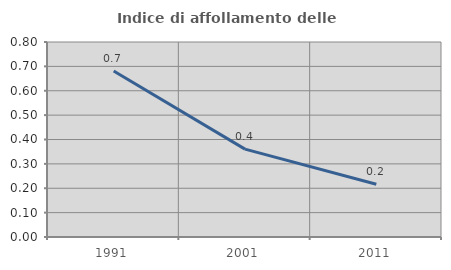
| Category | Indice di affollamento delle abitazioni  |
|---|---|
| 1991.0 | 0.681 |
| 2001.0 | 0.361 |
| 2011.0 | 0.217 |